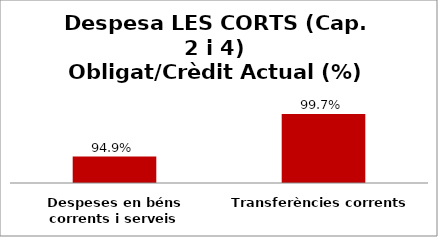
| Category | Series 0 |
|---|---|
| Despeses en béns corrents i serveis | 0.949 |
| Transferències corrents | 0.997 |